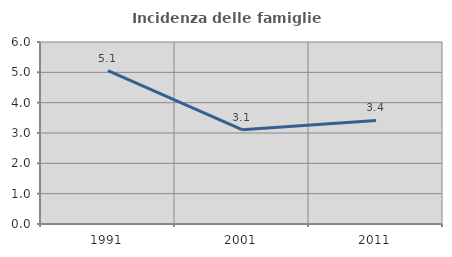
| Category | Incidenza delle famiglie numerose |
|---|---|
| 1991.0 | 5.056 |
| 2001.0 | 3.11 |
| 2011.0 | 3.416 |